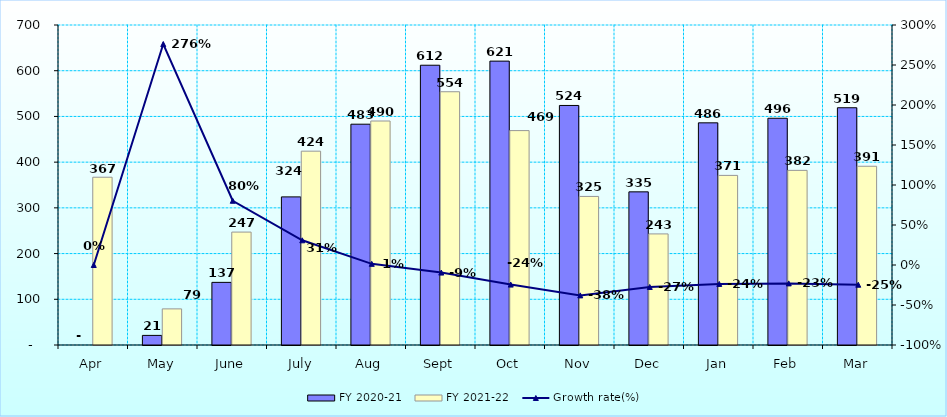
| Category | FY 2020-21 | FY 2021-22 |
|---|---|---|
| Apr | 0 | 367 |
| May | 21 | 79 |
| June | 137 | 247 |
| July | 324 | 424 |
| Aug | 483 | 490 |
| Sept | 612 | 554 |
| Oct | 621 | 469 |
| Nov | 524 | 325 |
| Dec | 335 | 243 |
| Jan | 486 | 371 |
| Feb | 496 | 382 |
| Mar | 519 | 391 |